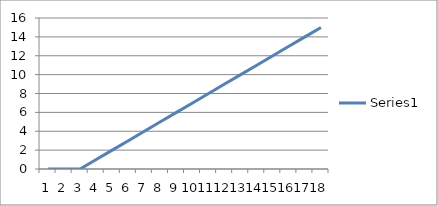
| Category | Series 0 |
|---|---|
| 0 | 0 |
| 1 | 0 |
| 2 | 0 |
| 3 | 1 |
| 4 | 2 |
| 5 | 3 |
| 6 | 4 |
| 7 | 5 |
| 8 | 6 |
| 9 | 7 |
| 10 | 8 |
| 11 | 9 |
| 12 | 10 |
| 13 | 11 |
| 14 | 12 |
| 15 | 13 |
| 16 | 14 |
| 17 | 15 |